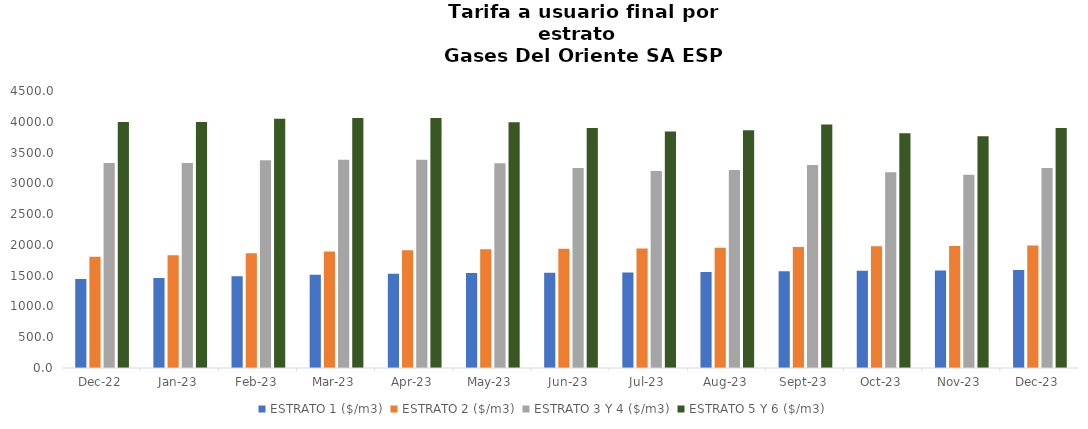
| Category | ESTRATO 1 ($/m3) | ESTRATO 2 ($/m3) | ESTRATO 3 Y 4 ($/m3) | ESTRATO 5 Y 6 ($/m3) |
|---|---|---|---|---|
| 2022-12-01 | 1444.79 | 1808.19 | 3331.66 | 3997.992 |
| 2023-01-01 | 1462.96 | 1831 | 3330.8 | 3996.96 |
| 2023-02-01 | 1488.96 | 1863.54 | 3374.22 | 4049.064 |
| 2023-03-01 | 1513.69 | 1894.49 | 3383.42 | 4060.104 |
| 2023-04-01 | 1529.59 | 1914.39 | 3383.42 | 4060.104 |
| 2023-05-01 | 1541.54 | 1929.36 | 3326.59 | 3991.908 |
| 2023-06-01 | 1548.28 | 1937.78 | 3250.2 | 3900.24 |
| 2023-07-01 | 1551.99 | 1942.43 | 3200.63 | 3840.756 |
| 2023-08-01 | 1560.7 | 1953.33 | 3217.02 | 3860.424 |
| 2023-09-01 | 1571.61 | 1966.99 | 3297.13 | 3956.556 |
| 2023-10-01 | 1579.97 | 1977.45 | 3179.1 | 3814.92 |
| 2023-11-01 | 1583.91 | 1982.39 | 3137.6 | 3765.12 |
| 2023-12-01 | 1591.49 | 1991.6 | 3248.56 | 3898.272 |